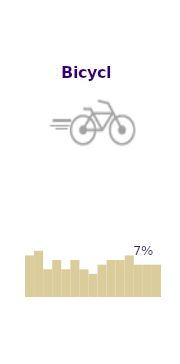
| Category | Bicycle |
|---|---|
| 1989.0 | 9 |
| 1992.0 | 10 |
| 1994.0 | 6 |
| 1996.0 | 8 |
| 1998.0 | 6 |
| 2000.0 | 8 |
| 2002.0 | 6 |
| 2004.0 | 5 |
| 2006.0 | 7 |
| 2008.0 | 8 |
| 2010.0 | 8 |
| 2012.0 | 9 |
| 2014.0 | 7 |
| 2015.0 | 7 |
| 2016.0 | 7 |